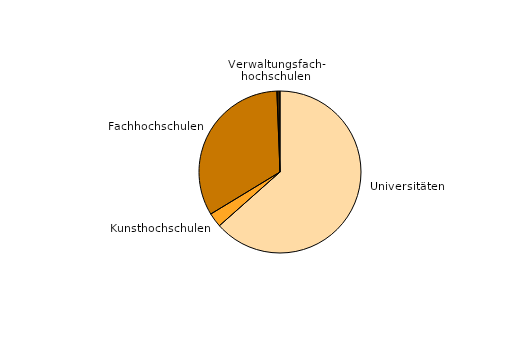
| Category | Series 0 |
|---|---|
| Universitäten | 129359 |
| Kunsthochschulen | 5839 |
| Fachhochschulen | 67419 |
| Verwaltungsfach-
hochschulen | 1252 |